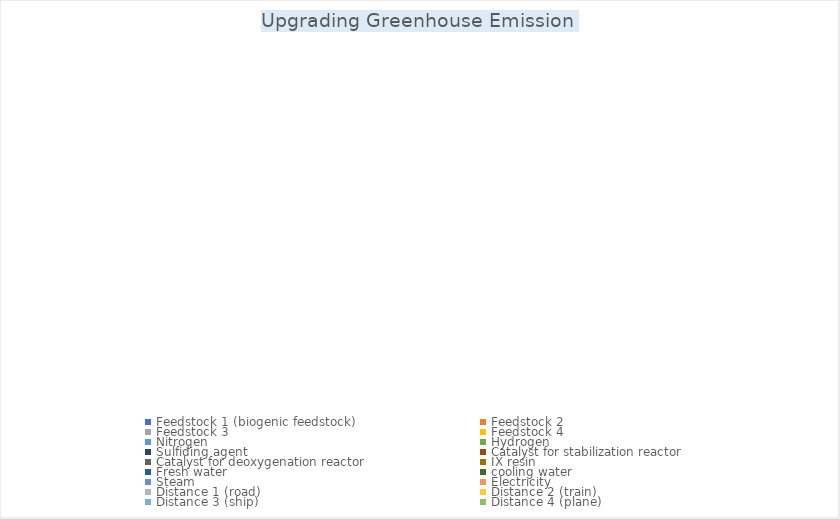
| Category | Greenhouse Emission  |
|---|---|
| Feedstock 1 (biogenic feedstock) | 0 |
| Feedstock 2 | 0 |
| Feedstock 3 | 0 |
| Feedstock 4 | 0 |
| Nitrogen | 0 |
| Hydrogen | 0 |
| Sulfiding agent | 0 |
| Catalyst for stabilization reactor | 0 |
| Catalyst for deoxygenation reactor | 0 |
| IX resin | 0 |
| Fresh water | 0 |
| cooling water | 0 |
| Steam | 0 |
| Electricity  | 0 |
| Distance 1 (road) | 0 |
| Distance 2 (train) | 0 |
| Distance 3 (ship) | 0 |
| Distance 4 (plane) | 0 |